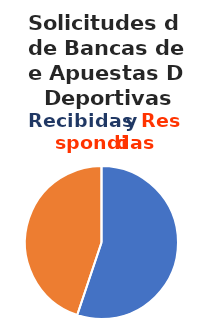
| Category | Series 0 |
|---|---|
| 0 | 59 |
| 1 | 48 |